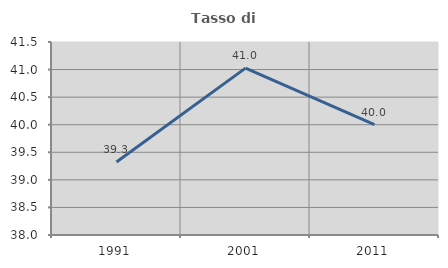
| Category | Tasso di occupazione   |
|---|---|
| 1991.0 | 39.324 |
| 2001.0 | 41.026 |
| 2011.0 | 40 |